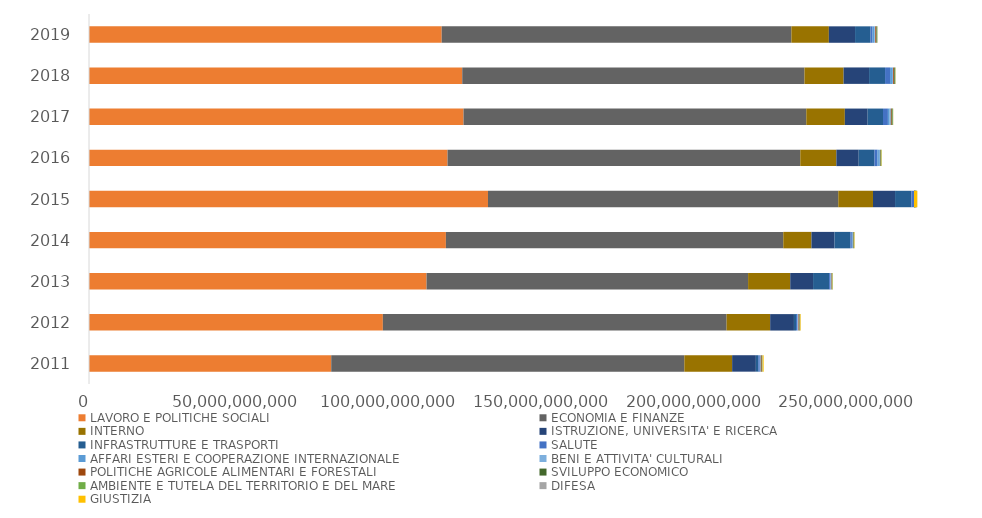
| Category | LAVORO E POLITICHE SOCIALI | ECONOMIA E FINANZE | INTERNO | ISTRUZIONE, UNIVERSITA' E RICERCA | INFRASTRUTTURE E TRASPORTI | SALUTE | AFFARI ESTERI E COOPERAZIONE INTERNAZIONALE | BENI E ATTIVITA' CULTURALI | POLITICHE AGRICOLE ALIMENTARI E FORESTALI | SVILUPPO ECONOMICO | AMBIENTE E TUTELA DEL TERRITORIO E DEL MARE | DIFESA | GIUSTIZIA |
|---|---|---|---|---|---|---|---|---|---|---|---|---|---|
| 2011.0 | 79274775216.03 | 115559914823.79 | 15647094596.11 | 7760412345.04 | 778164133.29 | 511717477.28 | 17173416.37 | 317780835.73 | 296695190 | 122938274.56 | 139650429.55 | 66843705.36 | 302091567 |
| 2012.0 | 96173665640.88 | 112490949506.98 | 14262855294.94 | 7782524470.71 | 678263984.96 | 482803818.18 | 16223182.19 | 304758652.37 | 294637932.49 | 119718713 | 138384639.96 | 47425855.8 | 171720129 |
| 2013.0 | 110470859415.06 | 105230520999.53 | 13792864862.67 | 7471936501.37 | 5244621892.83 | 461089931.08 | 17700481 | 297325390 | 147066578.3 | 96159365.41 | 141090301.23 | 44616495.75 | 77400115 |
| 2014.0 | 116802820292.76 | 110413431325.88 | 9222896206.17 | 7527260609.14 | 5248010301.87 | 451297526.32 | 17265022.09 | 340962859.24 | 152720365.26 | 127429341.82 | 154977165.65 | 41745598.63 | 111218594 |
| 2015.0 | 130576639097.13 | 114641971017.41 | 11359332404.29 | 7221801340.82 | 5329104198.07 | 934912690.99 | 18006171 | 333225051.21 | 145286918.23 | 287056145.33 | 170871852.62 | 61586757.6 | 132891992 |
| 2016.0 | 117337438449.83 | 115441933772.41 | 11811998849.28 | 7309419233.09 | 5168987953.02 | 975067531.35 | 470065832.21 | 349722117.67 | 134749236.64 | 175676162.49 | 184620380.62 | 47427865.56 | 88386138 |
| 2017.0 | 122575873650.91 | 112176677611.11 | 12611749383.35 | 7465828008.98 | 5023301344.22 | 1608498778.78 | 575554287.76 | 384394417.39 | 296339957.65 | 271842477.16 | 139130626.59 | 48748469.79 | 37504250.25 |
| 2018.0 | 122153449268.51 | 111996443568.71 | 12799789812.67 | 8346267834.79 | 5228936423.67 | 1648054029.91 | 618098607.79 | 388259054.3 | 302465360.55 | 248434570.29 | 154031881.29 | 101495469.71 | 55216406.2 |
| 2019.0 | 115429389259.58 | 114442200210.95 | 12264138241.67 | 8573197659.01 | 5076482920 | 657985791.82 | 542153325.36 | 333889898.56 | 333236312.52 | 194394086.3 | 162416667.96 | 83088554.57 | 20632054.61 |